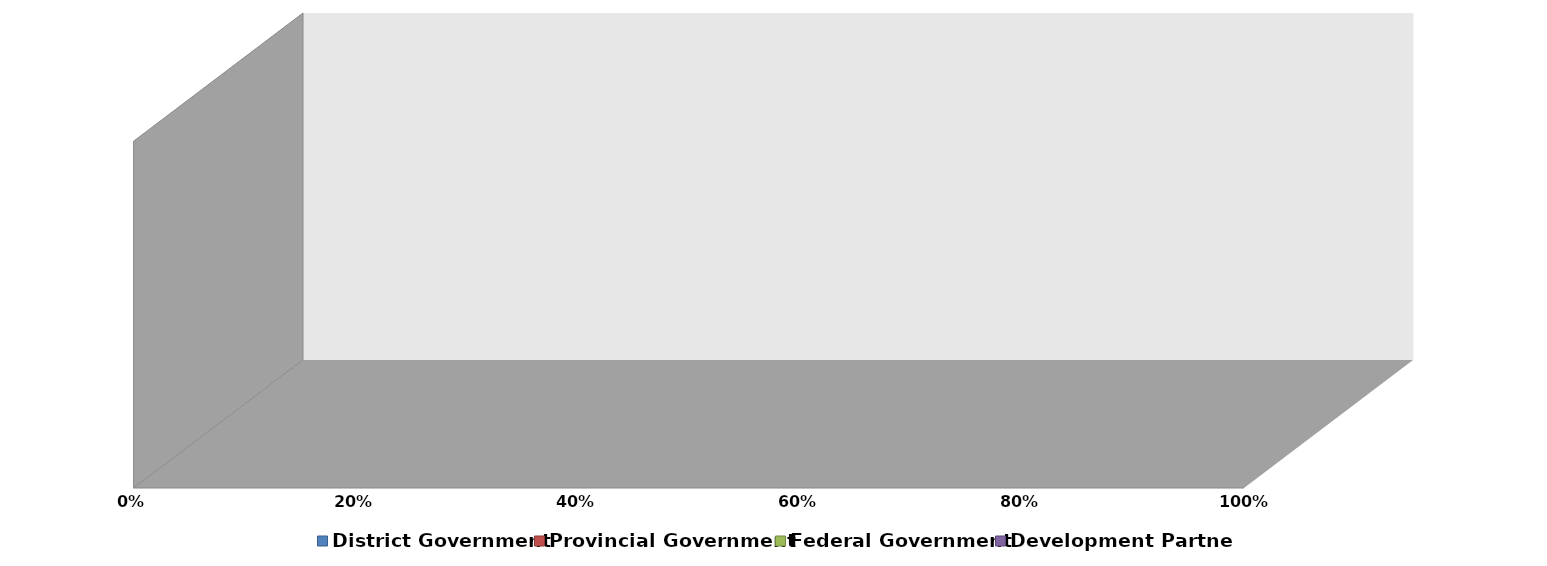
| Category |  District Government  |  Provincial Government  |  Federal Government  |  Development Partners  |
|---|---|---|---|---|
| 0 | 0 | 0 | 0 | 0 |